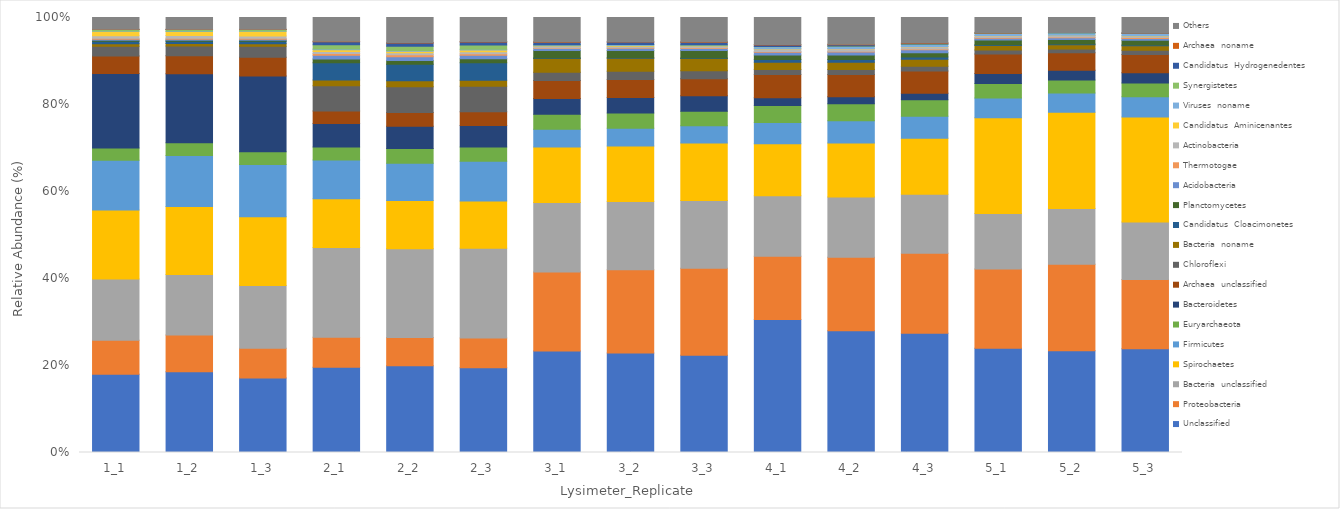
| Category | Unclassified | Proteobacteria | Bacteria  unclassified | Spirochaetes | Firmicutes | Euryarchaeota | Bacteroidetes | Archaea  unclassified | Chloroflexi | Bacteria  noname | Candidatus  Cloacimonetes | Planctomycetes | Acidobacteria | Thermotogae | Actinobacteria | Candidatus  Aminicenantes | Viruses  noname | Synergistetes | Candidatus  Hydrogenedentes | Archaea  noname | Others |
|---|---|---|---|---|---|---|---|---|---|---|---|---|---|---|---|---|---|---|---|---|---|
| 1_1 | 17.991 | 7.82 | 14.09 | 15.837 | 11.438 | 2.822 | 17.148 | 3.981 | 2.287 | 0.579 | 0.538 | 0.249 | 0.223 | 0.251 | 0.535 | 1.025 | 0.074 | 0.356 | 0.003 | 0.048 | 2.703 |
| 1_2 | 18.587 | 8.405 | 13.953 | 15.601 | 11.741 | 2.921 | 15.858 | 4.143 | 2.215 | 0.575 | 0.521 | 0.257 | 0.229 | 0.24 | 0.596 | 0.953 | 0.076 | 0.378 | 0.003 | 0.05 | 2.699 |
| 1_3 | 17.139 | 6.84 | 14.401 | 15.83 | 11.998 | 2.958 | 17.401 | 4.272 | 2.581 | 0.575 | 0.536 | 0.248 | 0.217 | 0.247 | 0.504 | 1.072 | 0.076 | 0.367 | 0.003 | 0.048 | 2.686 |
| 2_1 | 19.614 | 6.852 | 20.642 | 11.227 | 8.92 | 2.954 | 5.414 | 2.861 | 5.839 | 1.306 | 3.978 | 0.882 | 0.853 | 0.368 | 0.464 | 0.412 | 0.153 | 0.98 | 0.694 | 0.101 | 5.487 |
| 2_2 | 19.935 | 6.486 | 20.389 | 11.094 | 8.579 | 3.389 | 5.157 | 3.109 | 5.949 | 1.368 | 3.823 | 0.861 | 0.862 | 0.412 | 0.462 | 0.395 | 0.15 | 0.983 | 0.718 | 0.124 | 5.756 |
| 2_3 | 19.473 | 6.863 | 20.626 | 10.852 | 9.16 | 3.254 | 4.962 | 3.165 | 5.861 | 1.341 | 4.056 | 0.881 | 0.822 | 0.361 | 0.468 | 0.381 | 0.149 | 0.999 | 0.696 | 0.107 | 5.524 |
| 3_1 | 23.346 | 18.166 | 15.932 | 12.795 | 4.062 | 3.461 | 3.637 | 4.139 | 1.86 | 3.181 | 0.123 | 1.695 | 0.484 | 0.134 | 0.296 | 0.12 | 0.231 | 0.068 | 0.602 | 0.106 | 5.564 |
| 3_2 | 22.868 | 19.131 | 15.687 | 12.766 | 4.089 | 3.506 | 3.548 | 4.145 | 1.879 | 3.007 | 0.116 | 1.702 | 0.492 | 0.131 | 0.296 | 0.122 | 0.228 | 0.068 | 0.564 | 0.109 | 5.547 |
| 3_3 | 22.373 | 19.968 | 15.579 | 13.24 | 3.926 | 3.381 | 3.517 | 3.928 | 1.821 | 2.832 | 0.101 | 1.722 | 0.503 | 0.134 | 0.293 | 0.112 | 0.218 | 0.069 | 0.585 | 0.106 | 5.593 |
| 4_1 | 30.58 | 14.542 | 13.919 | 11.922 | 4.901 | 3.906 | 1.779 | 5.319 | 1.152 | 1.719 | 0.598 | 1.029 | 0.65 | 0.152 | 0.561 | 0.058 | 0.486 | 0.084 | 0.323 | 0.104 | 6.215 |
| 4_2 | 27.97 | 16.896 | 13.845 | 12.452 | 5.09 | 3.925 | 1.577 | 5.166 | 1.138 | 1.674 | 0.624 | 1.047 | 0.683 | 0.153 | 0.583 | 0.062 | 0.464 | 0.093 | 0.286 | 0.1 | 6.172 |
| 4_3 | 27.399 | 18.426 | 13.564 | 12.855 | 5.03 | 3.833 | 1.489 | 5.106 | 1.103 | 1.582 | 0.558 | 0.974 | 0.676 | 0.153 | 0.556 | 0.055 | 0.453 | 0.089 | 0.198 | 0.097 | 5.804 |
| 5_1 | 23.988 | 18.168 | 12.789 | 21.98 | 4.545 | 3.351 | 2.289 | 4.525 | 0.903 | 1.048 | 0.158 | 1.084 | 0.405 | 0.185 | 0.363 | 0.061 | 0.504 | 0.099 | 0.008 | 0.047 | 3.5 |
| 5_2 | 23.368 | 19.915 | 12.825 | 22.112 | 4.409 | 2.984 | 2.255 | 4.005 | 0.892 | 0.984 | 0.15 | 1.057 | 0.392 | 0.181 | 0.348 | 0.058 | 0.491 | 0.096 | 0.008 | 0.043 | 3.427 |
| 5_3 | 23.855 | 15.932 | 13.212 | 24.101 | 4.701 | 3.167 | 2.316 | 4.231 | 0.938 | 1.042 | 0.156 | 1.13 | 0.415 | 0.197 | 0.36 | 0.062 | 0.487 | 0.102 | 0.009 | 0.045 | 3.541 |